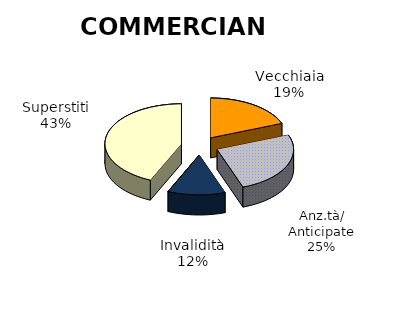
| Category | Series 0 |
|---|---|
| Vecchiaia | 5573 |
| Anz.tà/ Anticipate | 7422 |
| Invalidità | 3554 |
| Superstiti | 12646 |